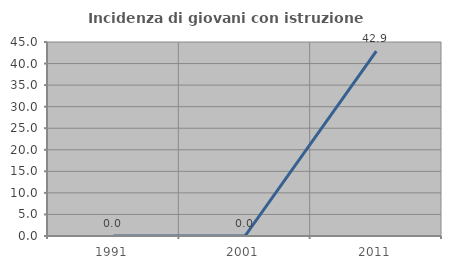
| Category | Incidenza di giovani con istruzione universitaria |
|---|---|
| 1991.0 | 0 |
| 2001.0 | 0 |
| 2011.0 | 42.857 |